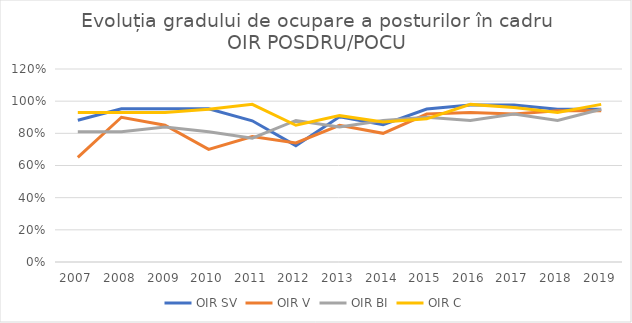
| Category | OIR SV | OIR V | OIR BI | OIR C |
|---|---|---|---|---|
| 2007.0 | 0.881 | 0.65 | 0.81 | 0.93 |
| 2008.0 | 0.952 | 0.9 | 0.81 | 0.93 |
| 2009.0 | 0.952 | 0.85 | 0.84 | 0.93 |
| 2010.0 | 0.952 | 0.7 | 0.81 | 0.95 |
| 2011.0 | 0.878 | 0.78 | 0.77 | 0.98 |
| 2012.0 | 0.723 | 0.74 | 0.88 | 0.85 |
| 2013.0 | 0.902 | 0.85 | 0.84 | 0.91 |
| 2014.0 | 0.854 | 0.8 | 0.88 | 0.87 |
| 2015.0 | 0.951 | 0.92 | 0.9 | 0.89 |
| 2016.0 | 0.976 | 0.93 | 0.88 | 0.98 |
| 2017.0 | 0.976 | 0.92 | 0.92 | 0.96 |
| 2018.0 | 0.95 | 0.94 | 0.88 | 0.93 |
| 2019.0 | 0.95 | 0.94 | 0.95 | 0.98 |